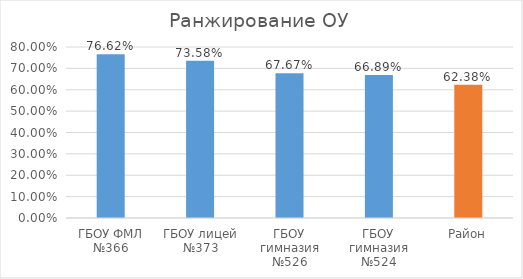
| Category | Series 0 |
|---|---|
| ГБОУ ФМЛ №366 | 0.766 |
| ГБОУ лицей №373 | 0.736 |
| ГБОУ гимназия №526 | 0.677 |
| ГБОУ гимназия №524 | 0.669 |
| Район | 0.624 |